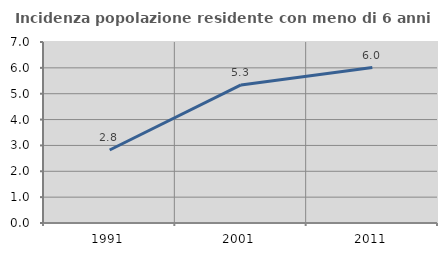
| Category | Incidenza popolazione residente con meno di 6 anni |
|---|---|
| 1991.0 | 2.824 |
| 2001.0 | 5.34 |
| 2011.0 | 6.013 |